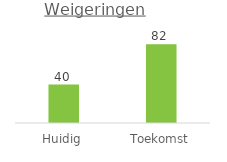
| Category | Weigeringen |
|---|---|
| Huidig | 40 |
| Toekomst | 82 |